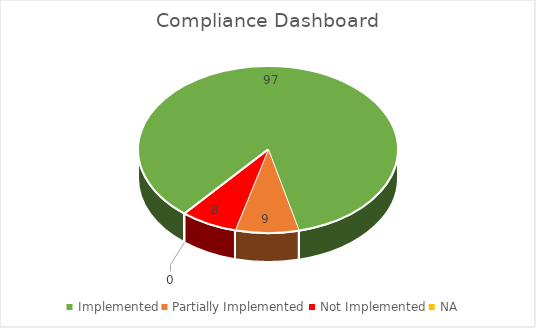
| Category | Series 0 |
|---|---|
| Implemented | 97 |
| Partially Implemented | 9 |
| Not Implemented | 8 |
| NA | 0 |